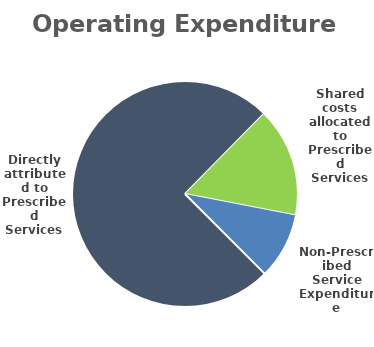
| Category | Series 0 |
|---|---|
| Directly attributed to Prescribed Services | 119.508 |
| Shared costs allocated to Prescribed Services | 25.045 |
| Non-Prescribed Service Expenditure | 15.07 |